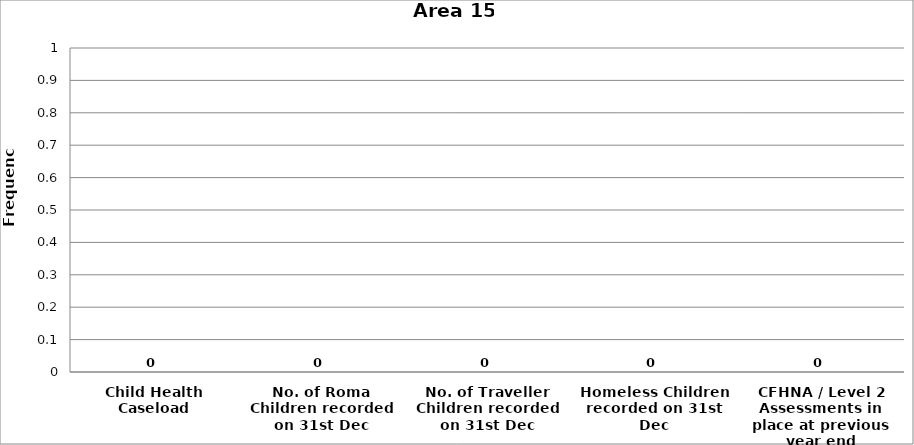
| Category | Area 15 |
|---|---|
| Child Health Caseload | 0 |
| No. of Roma Children recorded on 31st Dec | 0 |
| No. of Traveller Children recorded on 31st Dec | 0 |
| Homeless Children recorded on 31st Dec | 0 |
| CFHNA / Level 2 Assessments in place at previous year end | 0 |